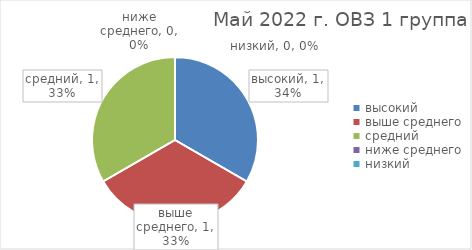
| Category | Series 0 |
|---|---|
| высокий | 1 |
| выше среднего | 1 |
| средний | 1 |
| ниже среднего | 0 |
| низкий | 0 |